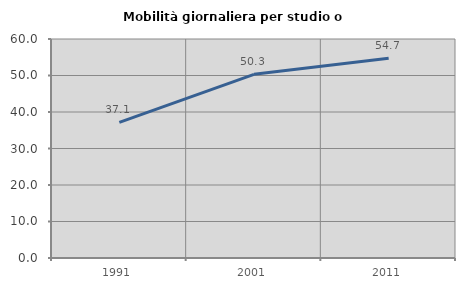
| Category | Mobilità giornaliera per studio o lavoro |
|---|---|
| 1991.0 | 37.138 |
| 2001.0 | 50.323 |
| 2011.0 | 54.743 |